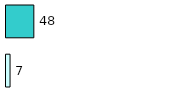
| Category | Series 0 | Series 1 |
|---|---|---|
| 0 | 7 | 48 |